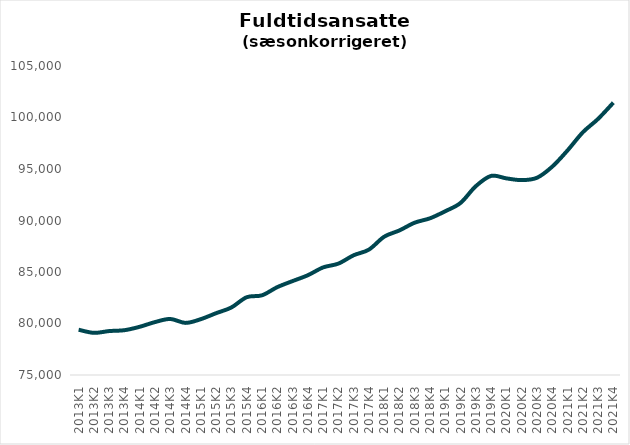
| Category | It-branchen i alt |
|---|---|
| 2013K1 | 79394.944 |
| 2013K2 | 79092.633 |
| 2013K3 | 79265.1 |
| 2013K4 | 79348.754 |
| 2014K1 | 79682.008 |
| 2014K2 | 80139.485 |
| 2014K3 | 80439.421 |
| 2014K4 | 80058.255 |
| 2015K1 | 80424.11 |
| 2015K2 | 81002.202 |
| 2015K3 | 81557.73 |
| 2015K4 | 82551.552 |
| 2016K1 | 82737.445 |
| 2016K2 | 83528.602 |
| 2016K3 | 84117.08 |
| 2016K4 | 84683.57 |
| 2017K1 | 85444.035 |
| 2017K2 | 85814.201 |
| 2017K3 | 86625.259 |
| 2017K4 | 87173.338 |
| 2018K1 | 88426.465 |
| 2018K2 | 89038.768 |
| 2018K3 | 89791.397 |
| 2018K4 | 90214.789 |
| 2019K1 | 90904.25 |
| 2019K2 | 91709.585 |
| 2019K3 | 93336.251 |
| 2019K4 | 94330.84 |
| 2020K1 | 94089.763 |
| 2020K2 | 93921.949 |
| 2020K3 | 94149.176 |
| 2020K4 | 95230.074 |
| 2021K1 | 96801.376 |
| 2021K2 | 98561.707 |
| 2021K3 | 99865.314 |
| 2021K4 | 101439.232 |